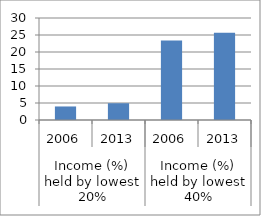
| Category | Series 0 |
|---|---|
| 0 | 3.98 |
| 1 | 4.93 |
| 2 | 23.35 |
| 3 | 25.69 |